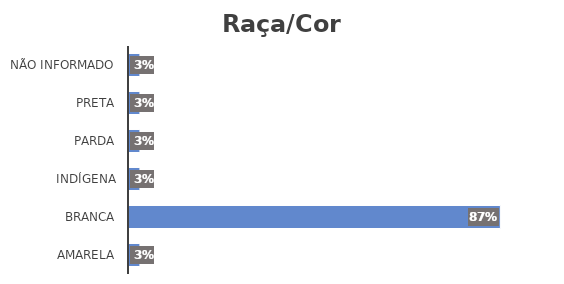
| Category | Series 0 |
|---|---|
| Amarela | 0.026 |
| Branca | 0.872 |
| Indígena | 0.026 |
| Parda | 0.026 |
| Preta | 0.026 |
| Não informado | 0.026 |